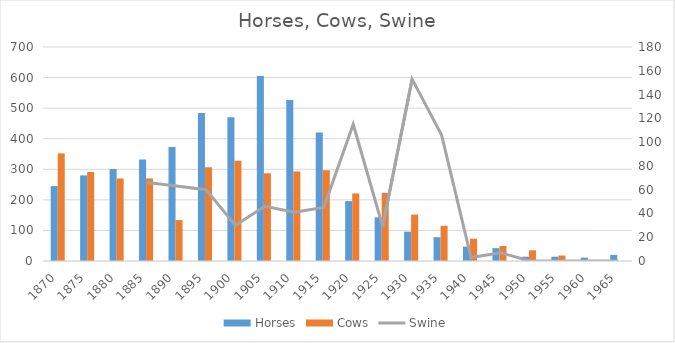
| Category | Horses | Cows |
|---|---|---|
| 1870.0 | 245 | 352 |
| 1875.0 | 280 | 291 |
| 1880.0 | 301 | 270 |
| 1885.0 | 332 | 270 |
| 1890.0 | 373 | 134 |
| 1895.0 | 484 | 307 |
| 1900.0 | 470 | 328 |
| 1905.0 | 605 | 287 |
| 1910.0 | 527 | 293 |
| 1915.0 | 420 | 297 |
| 1920.0 | 196 | 221 |
| 1925.0 | 143 | 223 |
| 1930.0 | 96 | 152 |
| 1935.0 | 78 | 115 |
| 1940.0 | 47 | 73 |
| 1945.0 | 42 | 49 |
| 1950.0 | 14 | 35 |
| 1955.0 | 14 | 18 |
| 1960.0 | 11 | 2 |
| 1965.0 | 20 | 0 |